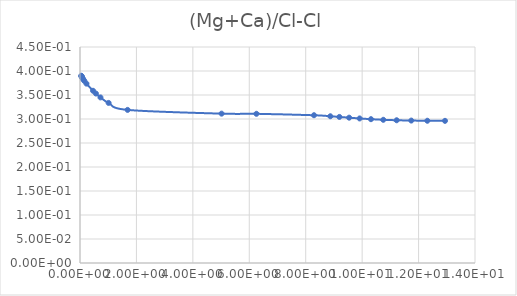
| Category | (Mg+Ca)/Cl |
|---|---|
| 0.045799 | 0.39 |
| 0.050887 | 0.389 |
| 0.057259 | 0.389 |
| 0.065457 | 0.388 |
| 0.076371 | 0.386 |
| 0.091686 | 0.385 |
| 0.11463 | 0.383 |
| 0.15299 | 0.379 |
| 0.22971 | 0.374 |
| 0.46165 | 0.359 |
| 0.56409 | 0.353 |
| 0.72494 | 0.345 |
| 1.0141 | 0.334 |
| 1.6871 | 0.319 |
| 5.0184 | 0.311 |
| 6.2531 | 0.311 |
| 8.2936 | 0.308 |
| 8.8726 | 0.306 |
| 9.1936 | 0.304 |
| 9.5386 | 0.303 |
| 9.9106 | 0.301 |
| 10.313 | 0.3 |
| 10.749 | 0.298 |
| 11.223 | 0.297 |
| 11.742 | 0.297 |
| 12.311 | 0.296 |
| 12.937 | 0.296 |